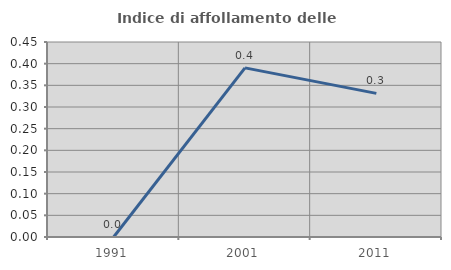
| Category | Indice di affollamento delle abitazioni  |
|---|---|
| 1991.0 | 0 |
| 2001.0 | 0.39 |
| 2011.0 | 0.331 |